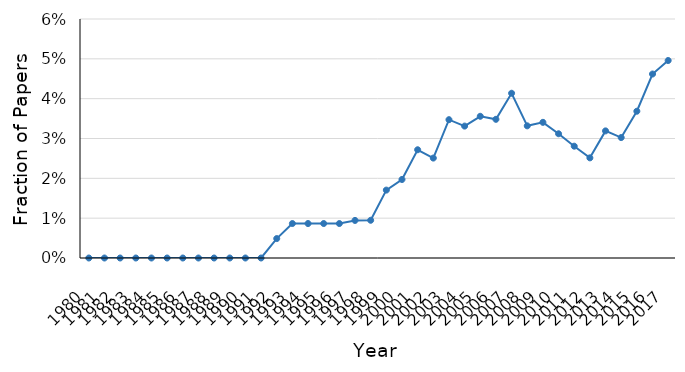
| Category | Quasi-Linear |
|---|---|
| 1980.0 | 0 |
| 1981.0 | 0 |
| 1982.0 | 0 |
| 1983.0 | 0 |
| 1984.0 | 0 |
| 1985.0 | 0 |
| 1986.0 | 0 |
| 1987.0 | 0 |
| 1988.0 | 0 |
| 1989.0 | 0 |
| 1990.0 | 0 |
| 1991.0 | 0 |
| 1992.0 | 0.005 |
| 1993.0 | 0.009 |
| 1994.0 | 0.009 |
| 1995.0 | 0.009 |
| 1996.0 | 0.009 |
| 1997.0 | 0.009 |
| 1998.0 | 0.009 |
| 1999.0 | 0.017 |
| 2000.0 | 0.02 |
| 2001.0 | 0.027 |
| 2002.0 | 0.025 |
| 2003.0 | 0.035 |
| 2004.0 | 0.033 |
| 2005.0 | 0.036 |
| 2006.0 | 0.035 |
| 2007.0 | 0.041 |
| 2008.0 | 0.033 |
| 2009.0 | 0.034 |
| 2010.0 | 0.031 |
| 2011.0 | 0.028 |
| 2012.0 | 0.025 |
| 2013.0 | 0.032 |
| 2014.0 | 0.03 |
| 2015.0 | 0.037 |
| 2016.0 | 0.046 |
| 2017.0 | 0.05 |